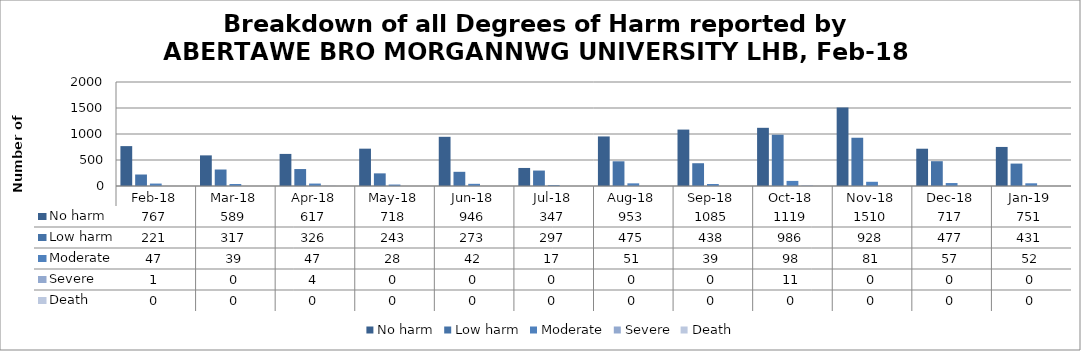
| Category | No harm | Low harm | Moderate | Severe | Death |
|---|---|---|---|---|---|
| Feb-18 | 767 | 221 | 47 | 1 | 0 |
| Mar-18 | 589 | 317 | 39 | 0 | 0 |
| Apr-18 | 617 | 326 | 47 | 4 | 0 |
| May-18 | 718 | 243 | 28 | 0 | 0 |
| Jun-18 | 946 | 273 | 42 | 0 | 0 |
| Jul-18 | 347 | 297 | 17 | 0 | 0 |
| Aug-18 | 953 | 475 | 51 | 0 | 0 |
| Sep-18 | 1085 | 438 | 39 | 0 | 0 |
| Oct-18 | 1119 | 986 | 98 | 11 | 0 |
| Nov-18 | 1510 | 928 | 81 | 0 | 0 |
| Dec-18 | 717 | 477 | 57 | 0 | 0 |
| Jan-19 | 751 | 431 | 52 | 0 | 0 |